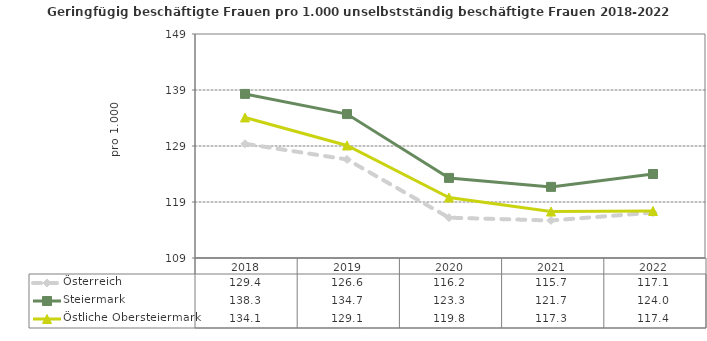
| Category | Österreich | Steiermark | Östliche Obersteiermark |
|---|---|---|---|
| 2022.0 | 117.1 | 124 | 117.4 |
| 2021.0 | 115.7 | 121.7 | 117.3 |
| 2020.0 | 116.2 | 123.3 | 119.8 |
| 2019.0 | 126.6 | 134.7 | 129.1 |
| 2018.0 | 129.4 | 138.3 | 134.1 |